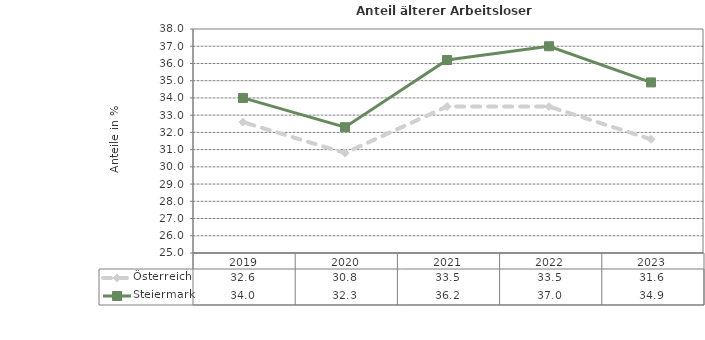
| Category | Österreich | Steiermark |
|---|---|---|
| 2023.0 | 31.6 | 34.9 |
| 2022.0 | 33.5 | 37 |
| 2021.0 | 33.5 | 36.2 |
| 2020.0 | 30.8 | 32.3 |
| 2019.0 | 32.6 | 34 |